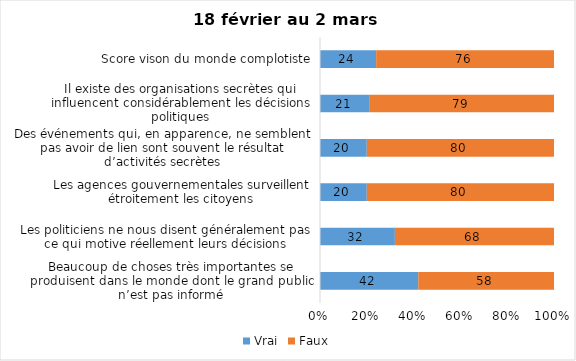
| Category | Vrai | Faux |
|---|---|---|
| Beaucoup de choses très importantes se produisent dans le monde dont le grand public n’est pas informé | 42 | 58 |
| Les politiciens ne nous disent généralement pas ce qui motive réellement leurs décisions | 32 | 68 |
| Les agences gouvernementales surveillent étroitement les citoyens | 20 | 80 |
| Des événements qui, en apparence, ne semblent pas avoir de lien sont souvent le résultat d’activités secrètes | 20 | 80 |
| Il existe des organisations secrètes qui influencent considérablement les décisions politiques | 21 | 79 |
| Score vison du monde complotiste | 24 | 76 |